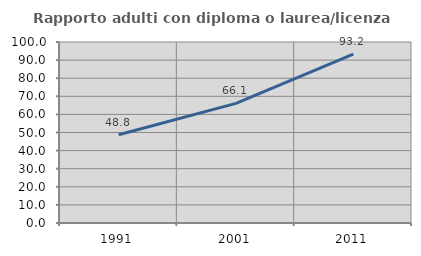
| Category | Rapporto adulti con diploma o laurea/licenza media  |
|---|---|
| 1991.0 | 48.78 |
| 2001.0 | 66.106 |
| 2011.0 | 93.247 |